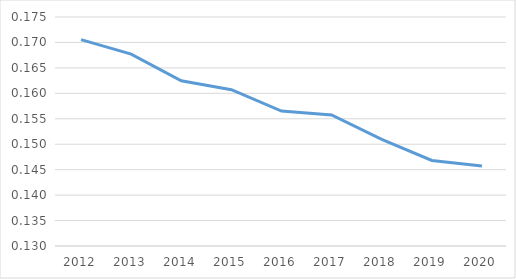
| Category | Émissions moyennes par kWh |
|---|---|
| 2012.0 | 0.171 |
| 2013.0 | 0.168 |
| 2014.0 | 0.162 |
| 2015.0 | 0.161 |
| 2016.0 | 0.157 |
| 2017.0 | 0.156 |
| 2018.0 | 0.151 |
| 2019.0 | 0.147 |
| 2020.0 | 0.146 |